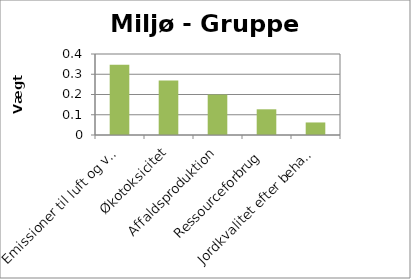
| Category | Vægt 1 |
|---|---|
| Emissioner til luft og vand | 0.347 |
| Økotoksicitet | 0.269 |
| Affaldsproduktion | 0.2 |
| Ressourceforbrug | 0.127 |
| Jordkvalitet efter behandling | 0.062 |